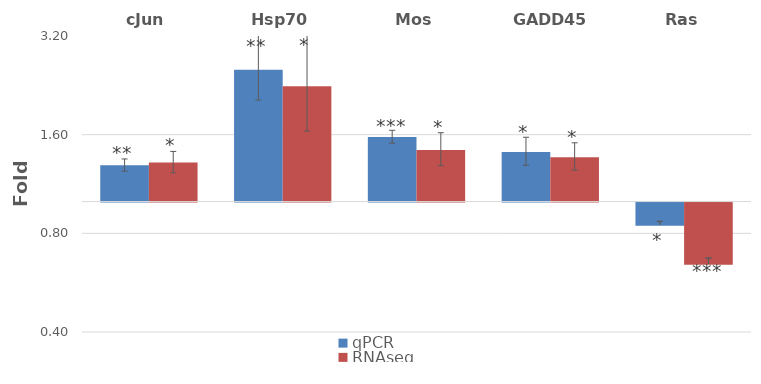
| Category | qPCR | RNAseq |
|---|---|---|
| cJun | 1.291 | 1.316 |
| Hsp70 | 2.524 | 2.249 |
| Mos | 1.575 | 1.435 |
| GADD45 | 1.417 | 1.366 |
| Ras | 0.85 | 0.646 |